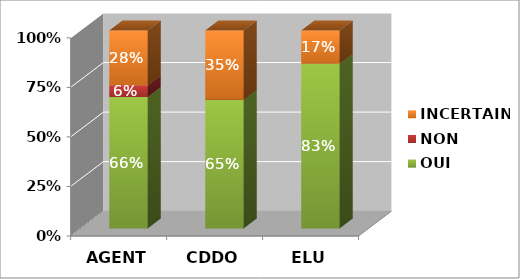
| Category | OUI | NON | INCERTAIN |
|---|---|---|---|
| AGENT | 0.663 | 0.059 | 0.277 |
| CDDO | 0.65 | 0 | 0.35 |
| ELU | 0.833 | 0 | 0.167 |